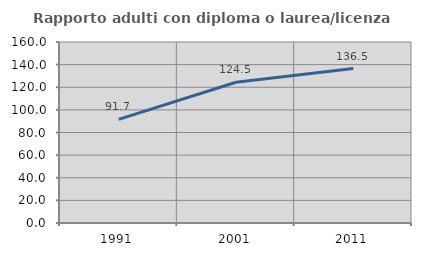
| Category | Rapporto adulti con diploma o laurea/licenza media  |
|---|---|
| 1991.0 | 91.657 |
| 2001.0 | 124.454 |
| 2011.0 | 136.536 |